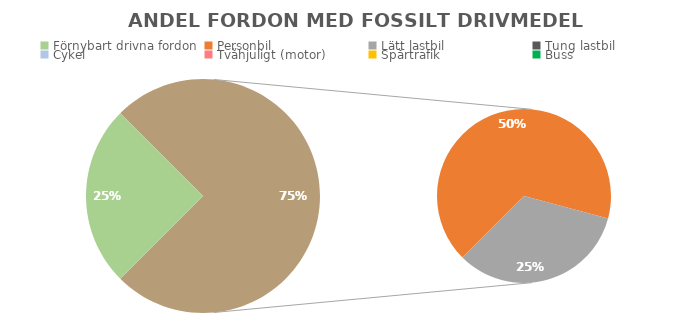
| Category | Series 0 |
|---|---|
| Förnybart drivna fordon | 1 |
| Personbil | 2 |
| Lätt lastbil | 1 |
| Tung lastbil | 0 |
| Cykel | 0 |
| Tvåhjuligt (motor) | 0 |
| Spårtrafik | 0 |
| Buss | 0 |